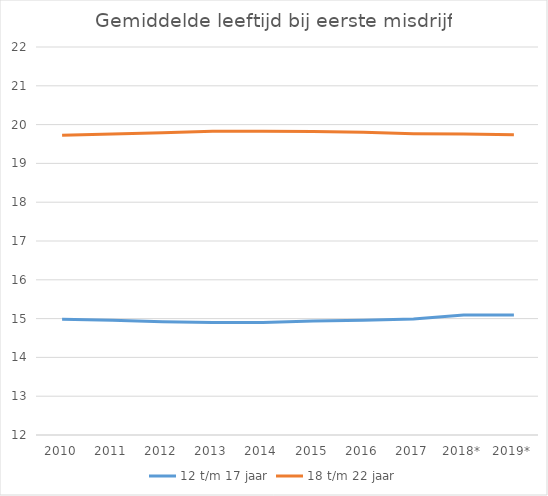
| Category | 12 t/m 17 jaar | 18 t/m 22 jaar |
|---|---|---|
| 2010 | 14.982 | 19.724 |
| 2011 | 14.959 | 19.76 |
| 2012 | 14.921 | 19.789 |
| 2013 | 14.9 | 19.829 |
| 2014 | 14.898 | 19.832 |
| 2015 | 14.94 | 19.823 |
| 2016 | 14.959 | 19.8 |
| 2017 | 14.992 | 19.764 |
| 2018* | 15.09 | 19.757 |
| 2019* | 15.095 | 19.741 |